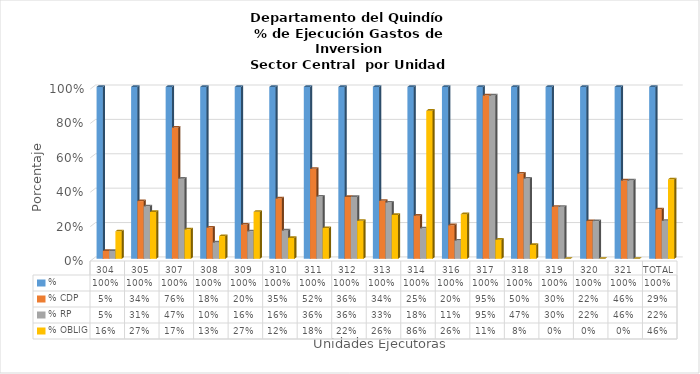
| Category | % | % CDP | % RP | % OBLIG |
|---|---|---|---|---|
| 304 | 1 | 0.046 | 0.046 | 0.16 |
| 305 | 1 | 0.336 | 0.306 | 0.272 |
| 307 | 1 | 0.763 | 0.466 | 0.171 |
| 308 | 1 | 0.182 | 0.095 | 0.132 |
| 309 | 1 | 0.199 | 0.16 | 0.274 |
| 310 | 1 | 0.351 | 0.165 | 0.121 |
| 311 | 1 | 0.523 | 0.362 | 0.179 |
| 312 | 1 | 0.36 | 0.36 | 0.221 |
| 313 | 1 | 0.337 | 0.327 | 0.255 |
| 314 | 1 | 0.251 | 0.178 | 0.861 |
| 316 | 1 | 0.195 | 0.106 | 0.259 |
| 317 | 1 | 0.95 | 0.95 | 0.111 |
| 318 | 1 | 0.496 | 0.467 | 0.081 |
| 319 | 1 | 0.303 | 0.303 | 0 |
| 320 | 1 | 0.219 | 0.219 | 0 |
| 321 | 1 | 0.456 | 0.456 | 0 |
| TOTAL | 1 | 0.288 | 0.221 | 0.462 |